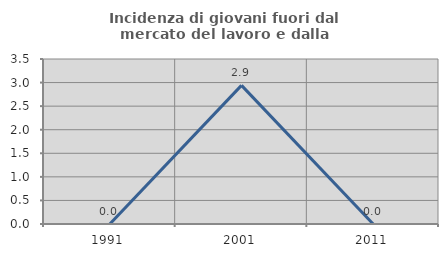
| Category | Incidenza di giovani fuori dal mercato del lavoro e dalla formazione  |
|---|---|
| 1991.0 | 0 |
| 2001.0 | 2.941 |
| 2011.0 | 0 |